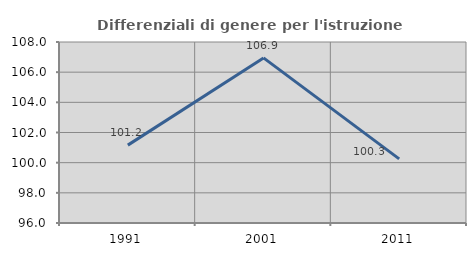
| Category | Differenziali di genere per l'istruzione superiore |
|---|---|
| 1991.0 | 101.162 |
| 2001.0 | 106.947 |
| 2011.0 | 100.254 |